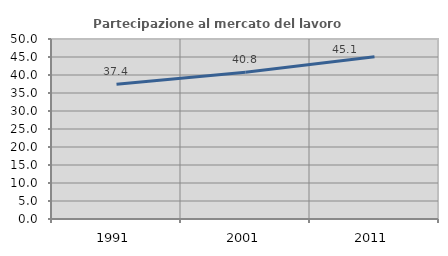
| Category | Partecipazione al mercato del lavoro  femminile |
|---|---|
| 1991.0 | 37.41 |
| 2001.0 | 40.751 |
| 2011.0 | 45.078 |